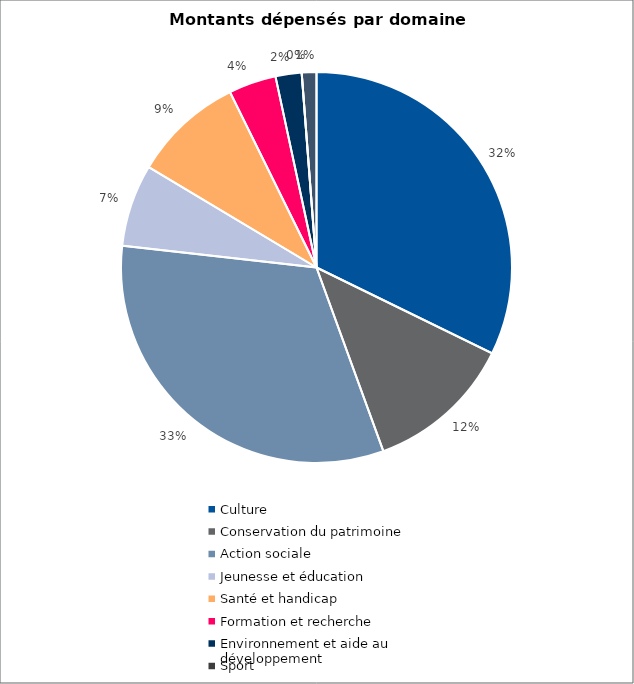
| Category | Series 0 |
|---|---|
| Culture | 11518715 |
| Conservation du patrimoine | 4365000 |
| Action sociale | 11555200 |
| Jeunesse et éducation | 2432600 |
| Santé et handicap | 3259000 |
| Formation et recherche | 1403000 |
| Environnement et aide au
développement | 771500 |
| Sport | 0 |
| Autres projets d’utilité publique | 432400 |